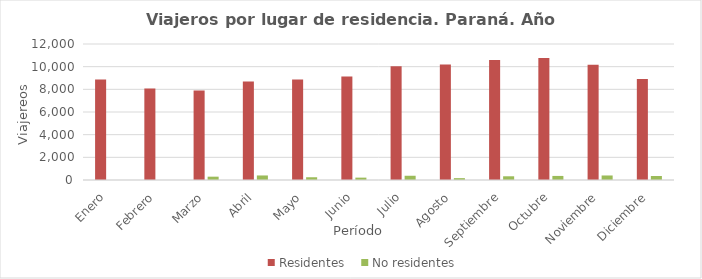
| Category | Residentes | No residentes |
|---|---|---|
| Enero | 8865 | 0 |
| Febrero | 8070 | 0 |
| Marzo | 7895 | 294 |
| Abril | 8696 | 400 |
| Mayo | 8857 | 243 |
| Junio | 9124 | 209 |
| Julio | 10031 | 375 |
| Agosto | 10186 | 164 |
| Septiembre | 10591 | 328 |
| Octubre | 10762 | 359 |
| Noviembre | 10175 | 399 |
| Diciembre | 8918 | 355 |